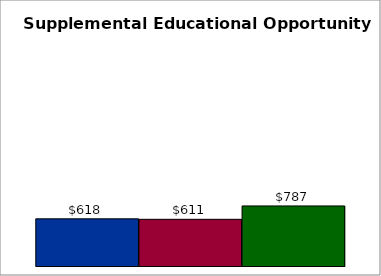
| Category | 50 states and D.C. | SREB states | State |
|---|---|---|---|
| 0 | 618.069 | 611.435 | 786.764 |